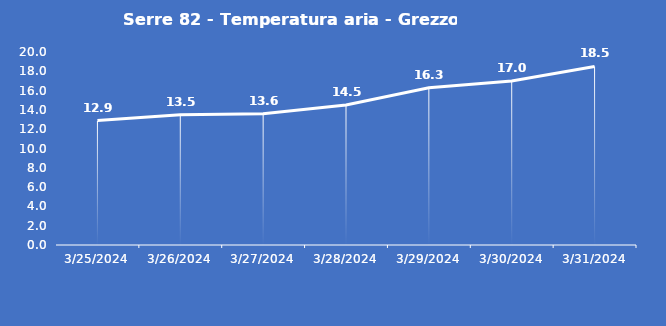
| Category | Serre 82 - Temperatura aria - Grezzo (°C) |
|---|---|
| 3/25/24 | 12.9 |
| 3/26/24 | 13.5 |
| 3/27/24 | 13.6 |
| 3/28/24 | 14.5 |
| 3/29/24 | 16.3 |
| 3/30/24 | 17 |
| 3/31/24 | 18.5 |